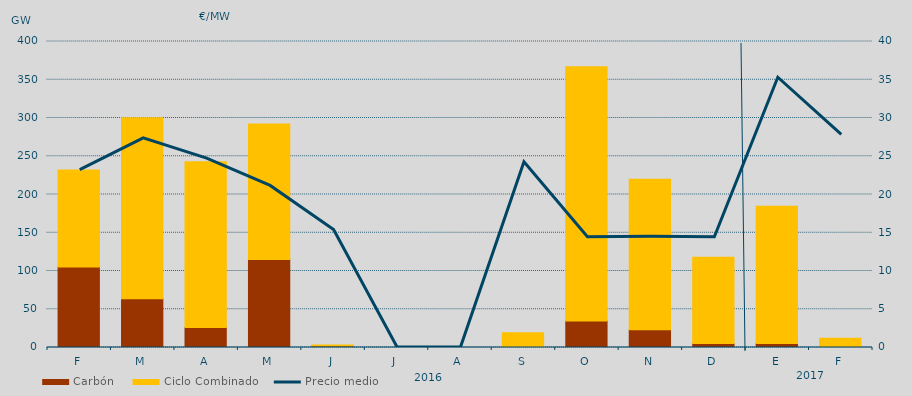
| Category | Carbón | Ciclo Combinado |
|---|---|---|
| F | 105334.2 | 126600.8 |
| M | 63887.5 | 236337.4 |
| A | 26224.4 | 216603.9 |
| M | 115140.8 | 176958.3 |
| J | 1863 | 1250.7 |
| J | 0 | 0 |
| A | 0 | 0 |
| S | 0 | 19356.8 |
| O | 34726.1 | 332294.3 |
| N | 23135.1 | 196729.3 |
| D | 5215.5 | 112859.3 |
| E | 5325.4 | 179227.5 |
| F | 1383.6 | 10714 |